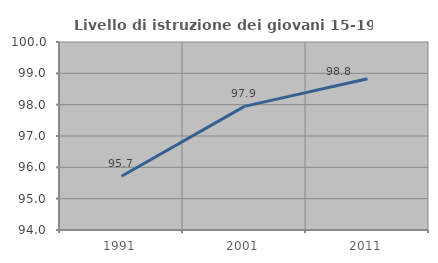
| Category | Livello di istruzione dei giovani 15-19 anni |
|---|---|
| 1991.0 | 95.717 |
| 2001.0 | 97.946 |
| 2011.0 | 98.826 |